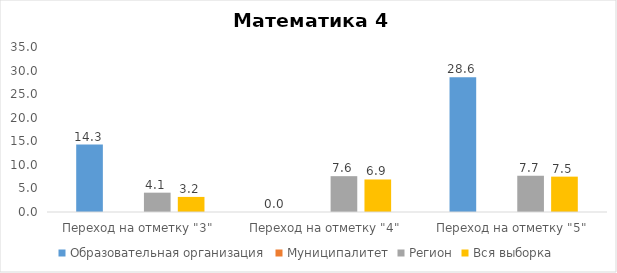
| Category | Образовательная организация | Муниципалитет | Регион | Вся выборка |
|---|---|---|---|---|
| Переход на отметку "3" | 14.3 |  | 4.1 | 3.2 |
| Переход на отметку "4" | 0 |  | 7.6 | 6.9 |
| Переход на отметку "5" | 28.6 |  | 7.7 | 7.5 |